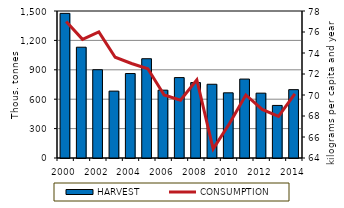
| Category | HARVEST |
|---|---|
| 2000.0 | 1475992 |
| 2001.0 | 1130477 |
| 2002.0 | 900843 |
| 2003.0 | 682511 |
| 2004.0 | 861798 |
| 2005.0 | 1013000 |
| 2006.0 | 692174 |
| 2007.0 | 820515 |
| 2008.0 | 769561 |
| 2009.0 | 752539 |
| 2010.0 | 665176 |
| 2011.0 | 805331 |
| 2012.0 | 661795.13 |
| 2013.0 | 536450 |
| 2014.0 | 697539.49 |